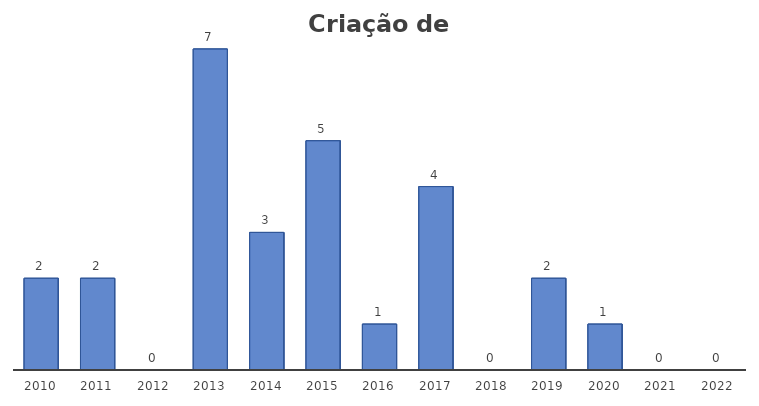
| Category | Número de Programas |
|---|---|
| 2010.0 | 2 |
| 2011.0 | 2 |
| 2012.0 | 0 |
| 2013.0 | 7 |
| 2014.0 | 3 |
| 2015.0 | 5 |
| 2016.0 | 1 |
| 2017.0 | 4 |
| 2018.0 | 0 |
| 2019.0 | 2 |
| 2020.0 | 1 |
| 2021.0 | 0 |
| 2022.0 | 0 |